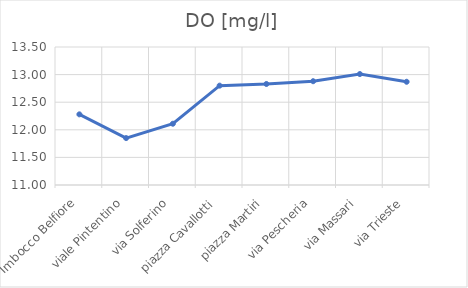
| Category | DO [mg/l] |
|---|---|
| Imbocco Belfiore | 12.28 |
| viale Pintentino | 11.85 |
| via Solferino | 12.11 |
| piazza Cavallotti | 12.8 |
| piazza Martiri | 12.83 |
| via Pescheria | 12.88 |
| via Massari | 13.01 |
| via Trieste | 12.87 |